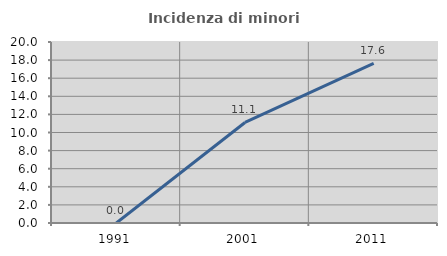
| Category | Incidenza di minori stranieri |
|---|---|
| 1991.0 | 0 |
| 2001.0 | 11.111 |
| 2011.0 | 17.647 |